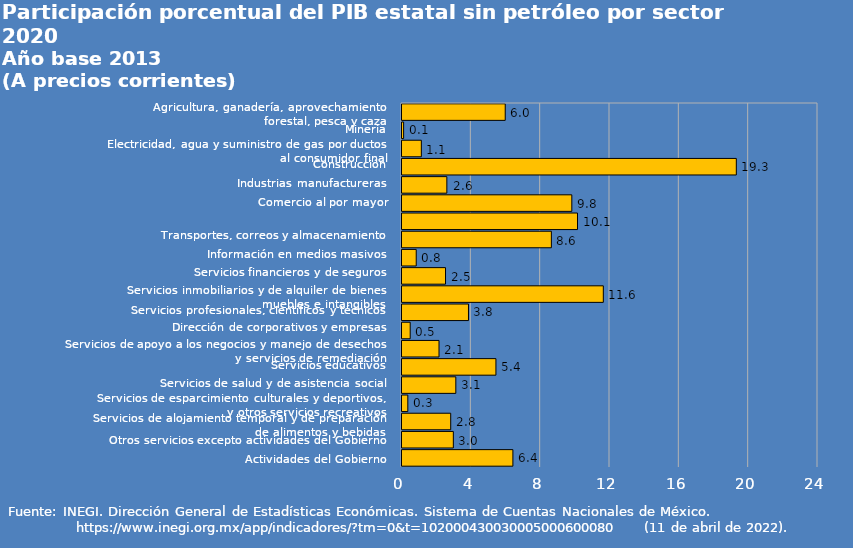
| Category | Campeche |
|---|---|
| Agricultura, ganadería, aprovechamiento forestal, pesca y caza | 5.955 |
| Minería | 0.093 |
| Electricidad, agua y suministro de gas por ductos al consumidor final | 1.116 |
| Construcción | 19.288 |
| Industrias manufactureras | 2.588 |
| Comercio al por mayor | 9.797 |
| Comercio al por menor | 10.125 |
| Transportes, correos y almacenamiento | 8.618 |
| Información en medios masivos | 0.821 |
| Servicios financieros y de seguros | 2.511 |
| Servicios inmobiliarios y de alquiler de bienes muebles e intangibles | 11.615 |
| Servicios profesionales, científicos y técnicos | 3.835 |
| Dirección de corporativos y empresas | 0.472 |
| Servicios de apoyo a los negocios y manejo de desechos y servicios de remediación | 2.135 |
| Servicios educativos | 5.419 |
| Servicios de salud y de asistencia social | 3.105 |
| Servicios de esparcimiento culturales y deportivos, y otros servicios recreativos | 0.336 |
| Servicios de alojamiento temporal y de preparación de alimentos y bebidas | 2.81 |
| Otros servicios excepto actividades del Gobierno | 2.962 |
| Actividades del Gobierno | 6.398 |